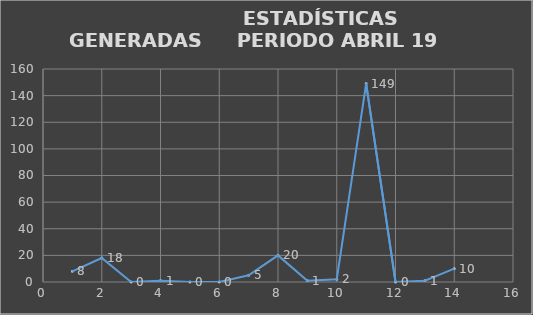
| Category |                   ESTADÍSTICAS GENERADAS  |
|---|---|
| 0 | 8 |
| 1 | 18 |
| 2 | 0 |
| 3 | 1 |
| 4 | 0 |
| 5 | 0 |
| 6 | 5 |
| 7 | 20 |
| 8 | 1 |
| 9 | 2 |
| 10 | 149 |
| 11 | 0 |
| 12 | 1 |
| 13 | 10 |